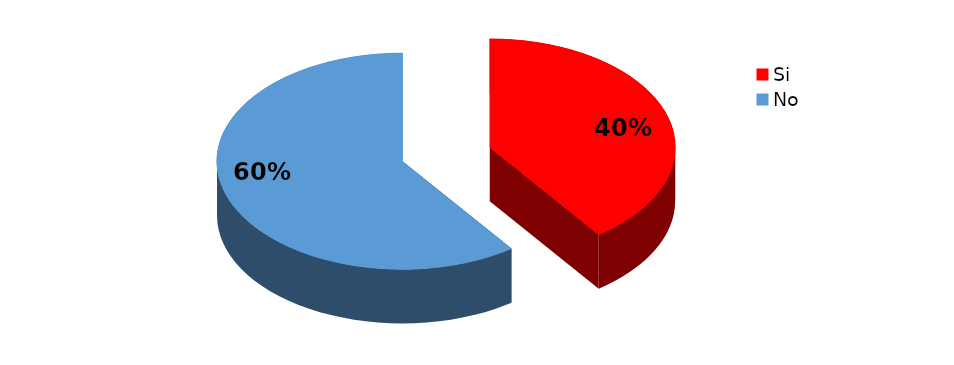
| Category | Series 0 |
|---|---|
| Si | 2 |
| No | 3 |